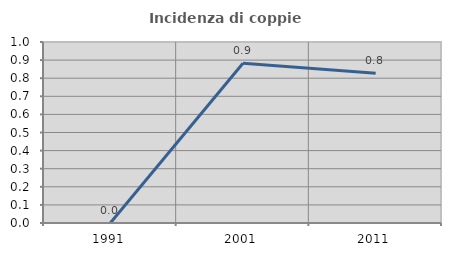
| Category | Incidenza di coppie miste |
|---|---|
| 1991.0 | 0 |
| 2001.0 | 0.882 |
| 2011.0 | 0.827 |